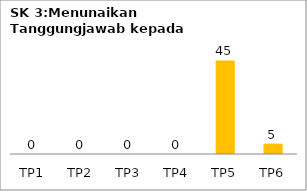
| Category | Bil Pel |
|---|---|
| TP1 | 0 |
| TP2 | 0 |
| TP3 | 0 |
| TP4 | 0 |
| TP5 | 45 |
| TP6 | 5 |